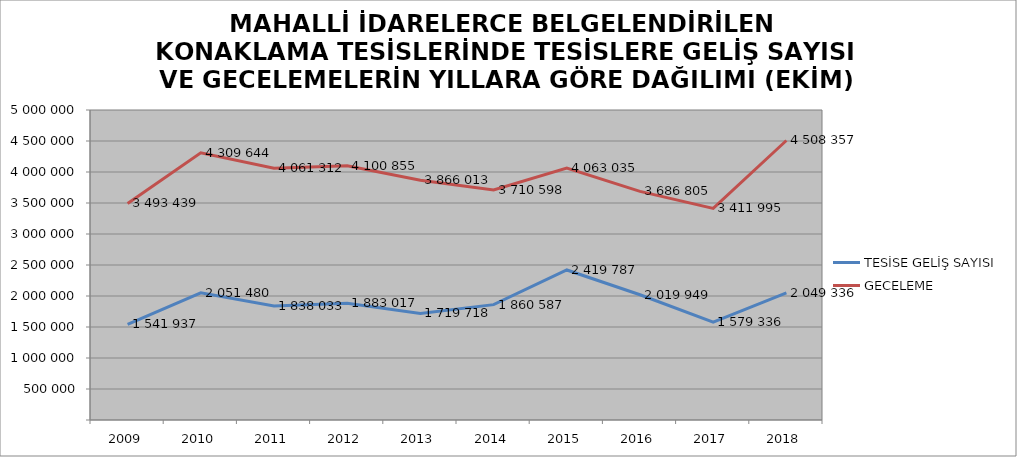
| Category | TESİSE GELİŞ SAYISI | GECELEME |
|---|---|---|
| 2009 | 1541937 | 3493439 |
| 2010 | 2051480 | 4309644 |
| 2011 | 1838033 | 4061312 |
| 2012 | 1883017 | 4100855 |
| 2013 | 1719718 | 3866013 |
| 2014 | 1860587 | 3710598 |
| 2015 | 2419787 | 4063035 |
| 2016 | 2019949 | 3686805 |
| 2017 | 1579336 | 3411995 |
| 2018 | 2049336 | 4508357 |